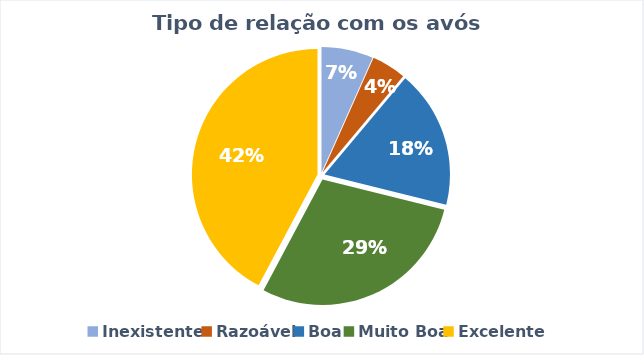
| Category | Series 0 |
|---|---|
| Inexistente  | 3 |
| Razoável | 2 |
| Boa | 8 |
| Muito Boa | 13 |
| Excelente | 19 |